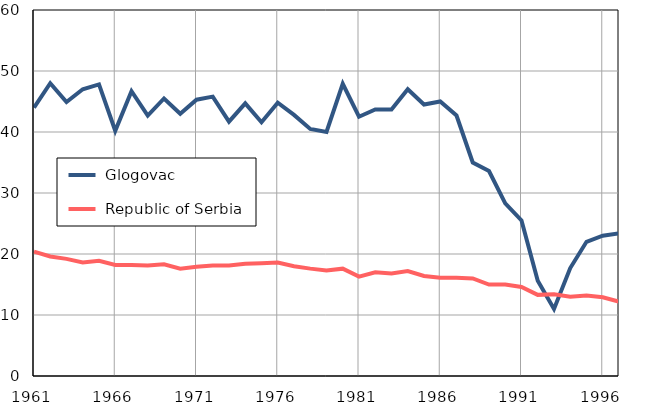
| Category |  Glogovac |  Republic of Serbia |
|---|---|---|
| 1961.0 | 44 | 20.4 |
| 1962.0 | 48 | 19.6 |
| 1963.0 | 44.9 | 19.2 |
| 1964.0 | 47 | 18.6 |
| 1965.0 | 47.8 | 18.9 |
| 1966.0 | 40.2 | 18.2 |
| 1967.0 | 46.7 | 18.2 |
| 1968.0 | 42.7 | 18.1 |
| 1969.0 | 45.5 | 18.3 |
| 1970.0 | 43 | 17.6 |
| 1971.0 | 45.3 | 17.9 |
| 1972.0 | 45.8 | 18.1 |
| 1973.0 | 41.7 | 18.1 |
| 1974.0 | 44.7 | 18.4 |
| 1975.0 | 41.6 | 18.5 |
| 1976.0 | 44.8 | 18.6 |
| 1977.0 | 42.8 | 18 |
| 1978.0 | 40.5 | 17.6 |
| 1979.0 | 40 | 17.3 |
| 1980.0 | 47.9 | 17.6 |
| 1981.0 | 42.5 | 16.3 |
| 1982.0 | 43.7 | 17 |
| 1983.0 | 43.7 | 16.8 |
| 1984.0 | 47 | 17.2 |
| 1985.0 | 44.5 | 16.4 |
| 1986.0 | 45 | 16.1 |
| 1987.0 | 42.7 | 16.1 |
| 1988.0 | 35 | 16 |
| 1989.0 | 33.6 | 15 |
| 1990.0 | 28.3 | 15 |
| 1991.0 | 25.5 | 14.6 |
| 1992.0 | 15.6 | 13.3 |
| 1993.0 | 11 | 13.4 |
| 1994.0 | 17.7 | 13 |
| 1995.0 | 22 | 13.2 |
| 1996.0 | 23 | 12.9 |
| 1997.0 | 23.4 | 12.2 |